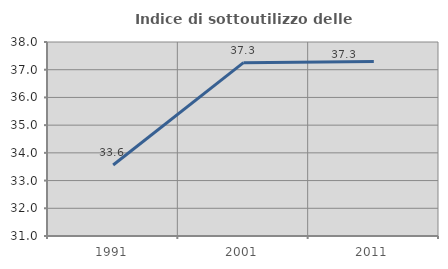
| Category | Indice di sottoutilizzo delle abitazioni  |
|---|---|
| 1991.0 | 33.562 |
| 2001.0 | 37.255 |
| 2011.0 | 37.292 |